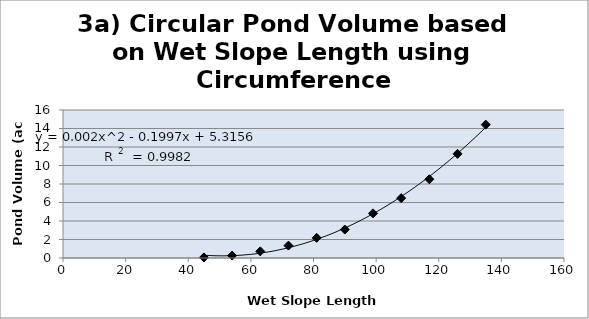
| Category | Series 0 |
|---|---|
| 45.0 | 0.064 |
| 54.0 | 0.257 |
| 63.0 | 0.719 |
| 72.0 | 1.342 |
| 81.0 | 2.179 |
| 90.0 | 3.074 |
| 99.0 | 4.826 |
| 108.0 | 6.472 |
| 117.0 | 8.511 |
| 126.0 | 11.26 |
| 135.0 | 14.417 |